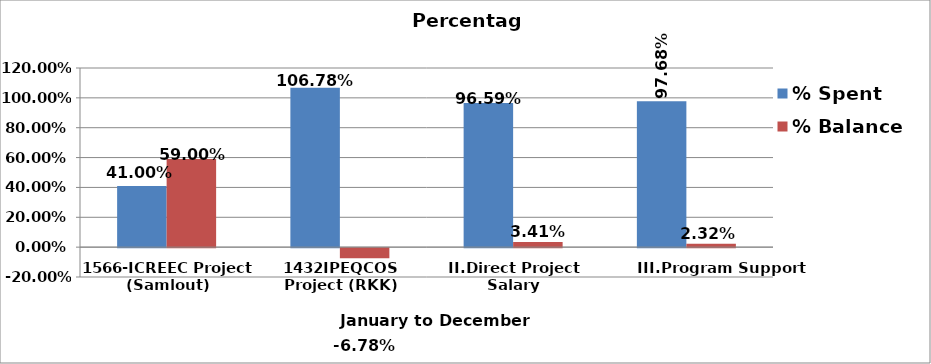
| Category | % Spent  | % Balance  |
|---|---|---|
| 1566-ICREEC Project (Samlout) | 0.41 | 0.59 |
| 1432IPEQCOS Project (RKK) | 1.068 | -0.068 |
| II.Direct Project Salary | 0.966 | 0.034 |
| III.Program Support | 0.977 | 0.023 |